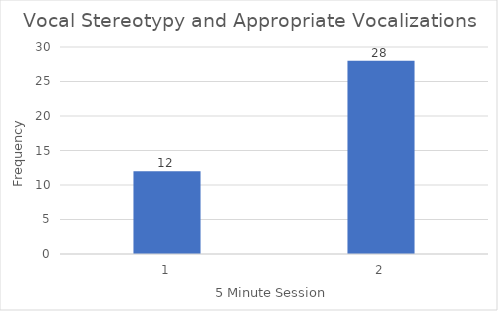
| Category | Series 0 |
|---|---|
| 0 | 12 |
| 1 | 28 |